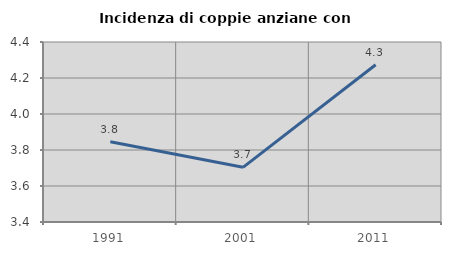
| Category | Incidenza di coppie anziane con figli |
|---|---|
| 1991.0 | 3.846 |
| 2001.0 | 3.704 |
| 2011.0 | 4.274 |